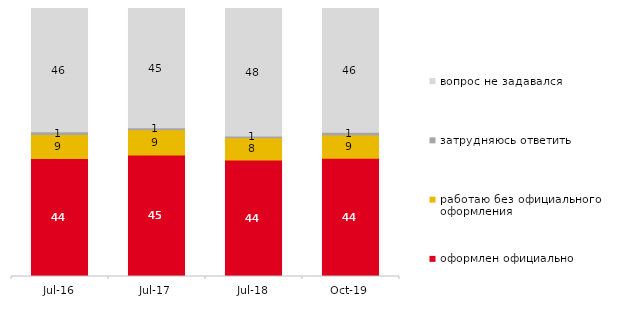
| Category | оформлен официально | работаю без официального оформления | затрудняюсь ответить | вопрос не задавался |
|---|---|---|---|---|
| 2016-07-01 | 44 | 9 | 1 | 46 |
| 2017-07-01 | 45.35 | 9.4 | 0.75 | 44.5 |
| 2018-07-01 | 43.5 | 8.3 | 0.65 | 47.55 |
| 2019-10-01 | 44.158 | 8.663 | 0.99 | 46.188 |